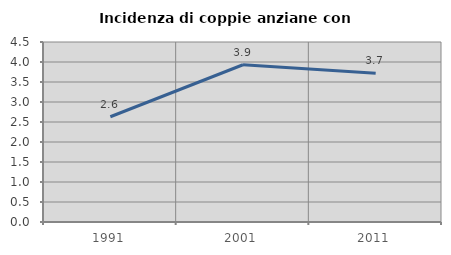
| Category | Incidenza di coppie anziane con figli |
|---|---|
| 1991.0 | 2.632 |
| 2001.0 | 3.932 |
| 2011.0 | 3.721 |